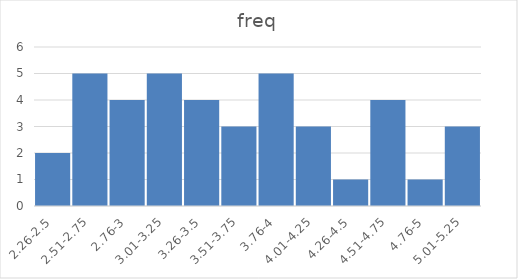
| Category | freq |
|---|---|
| 2.26-2.5 | 2 |
| 2.51-2.75 | 5 |
| 2.76-3 | 4 |
| 3.01-3.25 | 5 |
| 3.26-3.5 | 4 |
| 3.51-3.75 | 3 |
| 3.76-4 | 5 |
| 4.01-4.25 | 3 |
| 4.26-4.5 | 1 |
| 4.51-4.75 | 4 |
| 4.76-5 | 1 |
| 5.01-5.25 | 3 |